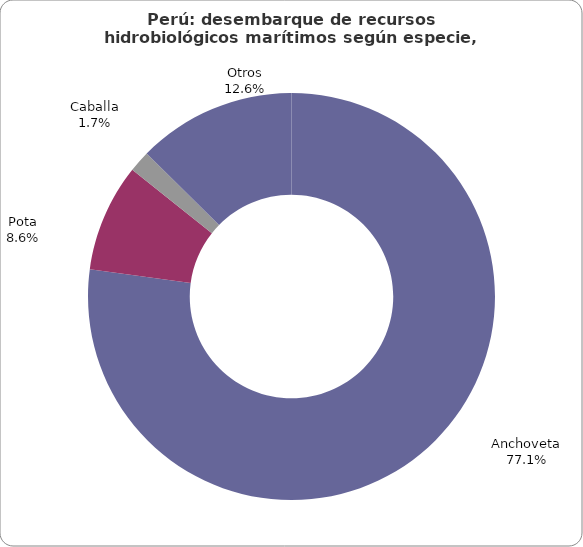
| Category | Series 0 |
|---|---|
| Anchoveta | 4118122.44 |
| Pota | 457363.878 |
| Caballa | 90514.795 |
| Otros | 673029.444 |